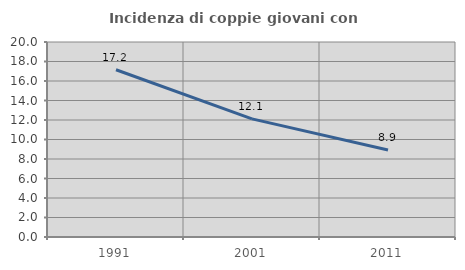
| Category | Incidenza di coppie giovani con figli |
|---|---|
| 1991.0 | 17.152 |
| 2001.0 | 12.112 |
| 2011.0 | 8.923 |